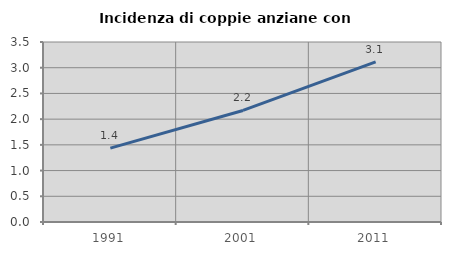
| Category | Incidenza di coppie anziane con figli |
|---|---|
| 1991.0 | 1.437 |
| 2001.0 | 2.169 |
| 2011.0 | 3.115 |